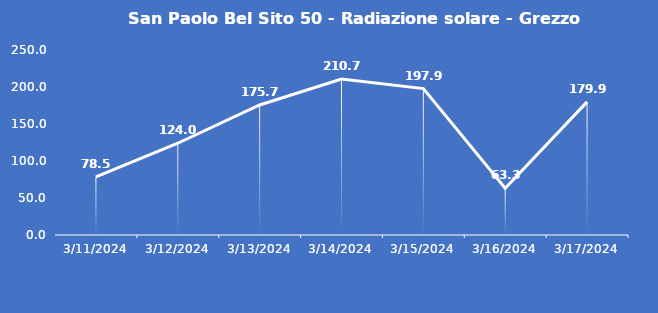
| Category | San Paolo Bel Sito 50 - Radiazione solare - Grezzo (W/m2) |
|---|---|
| 3/11/24 | 78.5 |
| 3/12/24 | 124 |
| 3/13/24 | 175.7 |
| 3/14/24 | 210.7 |
| 3/15/24 | 197.9 |
| 3/16/24 | 63.3 |
| 3/17/24 | 179.9 |